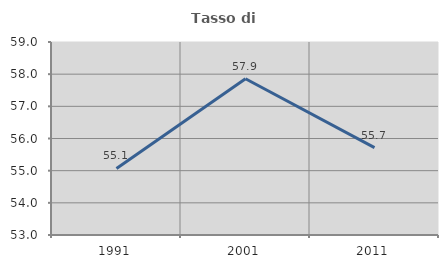
| Category | Tasso di occupazione   |
|---|---|
| 1991.0 | 55.069 |
| 2001.0 | 57.856 |
| 2011.0 | 55.716 |